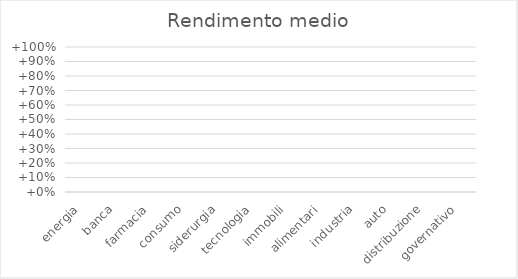
| Category | Rendimento medio |
|---|---|
| energia | 0 |
| banca | 0 |
| farmacia | 0 |
| consumo | 0 |
| siderurgia | 0 |
| tecnologia | 0 |
| immobili | 0 |
| alimentari | 0 |
| industria | 0 |
| auto | 0 |
| distribuzione | 0 |
| governativo | 0 |